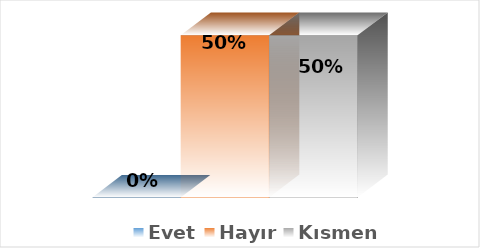
| Category | Evet | Hayır | Kısmen |
|---|---|---|---|
| 0 | 0 | 0.5 | 0.5 |